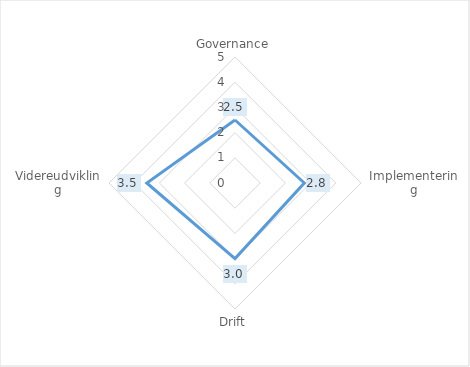
| Category | Series 0 |
|---|---|
| Governance | 2.5 |
| Implementering | 2.75 |
| Drift | 3 |
| Videreudvikling | 3.5 |